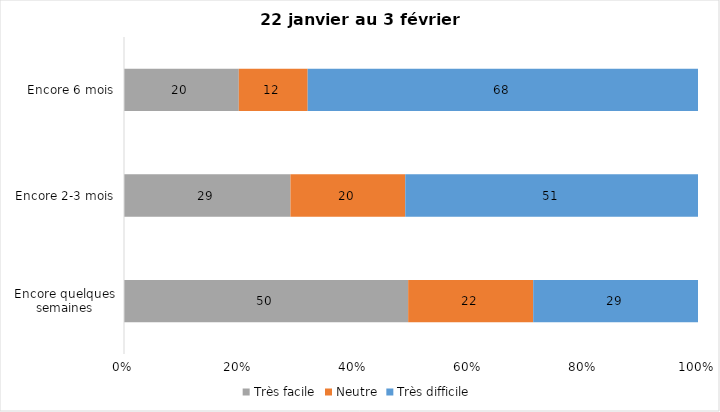
| Category | Très facile | Neutre | Très difficile |
|---|---|---|---|
| Encore quelques semaines | 50 | 22 | 29 |
| Encore 2-3 mois | 29 | 20 | 51 |
| Encore 6 mois | 20 | 12 | 68 |